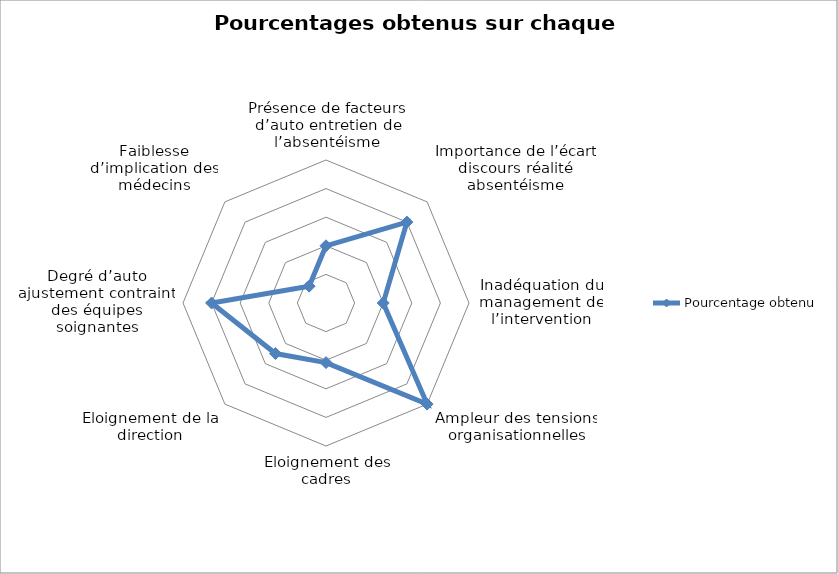
| Category | Pourcentage obtenu |
|---|---|
| Présence de facteurs d’auto entretien de l’absentéisme | 0.4 |
| Importance de l’écart discours réalité absentéisme | 0.8 |
| Inadéquation du management de l’intervention | 0.4 |
| Ampleur des tensions organisationnelles | 1 |
| Eloignement des cadres | 0.417 |
| Eloignement de la direction | 0.5 |
| Degré d’auto ajustement contraint des équipes soignantes | 0.8 |
| Faiblesse d’implication des médecins | 0.167 |